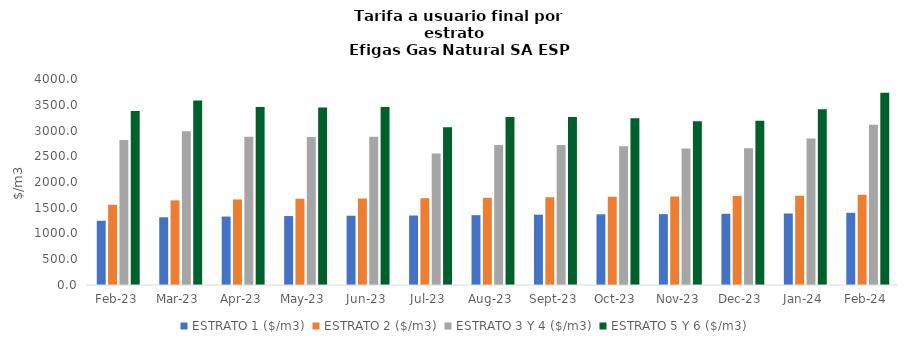
| Category | ESTRATO 1 ($/m3) | ESTRATO 2 ($/m3) | ESTRATO 3 Y 4 ($/m3) | ESTRATO 5 Y 6 ($/m3) |
|---|---|---|---|---|
| 2023-02-01 | 1247.16 | 1558.32 | 2816 | 3379.2 |
| 2023-03-01 | 1314.94 | 1642.54 | 2985.304 | 3582.364 |
| 2023-04-01 | 1328.75 | 1659.79 | 2880.614 | 3456.737 |
| 2023-05-01 | 1339.14 | 1672.77 | 2874.12 | 3448.944 |
| 2023-06-01 | 1344.99 | 1680.07 | 2880.614 | 3456.737 |
| 2023-07-01 | 1349.02 | 1685.11 | 2551.788 | 3062.145 |
| 2023-08-01 | 1355.78 | 1693.55 | 2720.369 | 3264.443 |
| 2023-09-01 | 1365.26 | 1705.39 | 2717.396 | 3260.875 |
| 2023-10-01 | 1372.52 | 1714.46 | 2696.262 | 3235.514 |
| 2023-11-01 | 1375.95 | 1718.74 | 2650.142 | 3180.171 |
| 2023-12-01 | 1382.4 | 1726.8 | 2657.262 | 3188.714 |
| 2024-01-01 | 1388.75 | 1734.74 | 2844.507 | 3413.408 |
| 2024-02-01 | 1401.46 | 1750.61 | 3112.31 | 3734.773 |